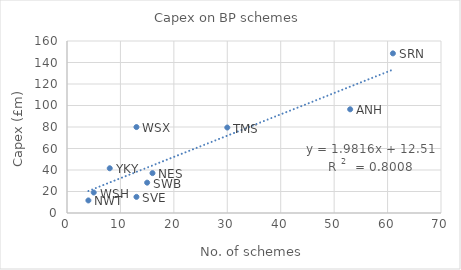
| Category | Series 0 |
|---|---|
| 53.0 | 96.469 |
| 16.0 | 37.081 |
| 4.0 | 11.688 |
| 61.0 | 148.476 |
| 13.0 | 15.009 |
| 15.0 | 28.226 |
| 30.0 | 79.501 |
| 5.0 | 19.066 |
| 13.0 | 79.948 |
| 8.0 | 41.614 |